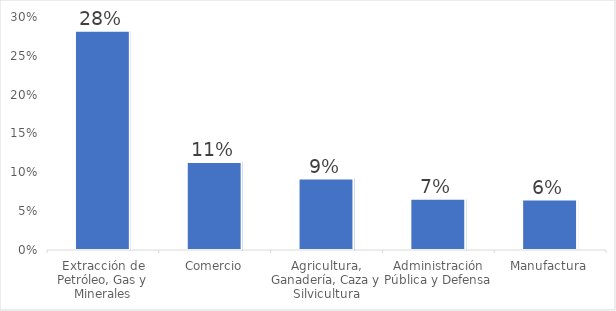
| Category | Series 0 |
|---|---|
| Extracción de Petróleo, Gas y Minerales | 0.282 |
| Comercio | 0.113 |
| Agricultura, Ganadería, Caza y Silvicultura | 0.092 |
| Administración Pública y Defensa | 0.066 |
| Manufactura | 0.065 |